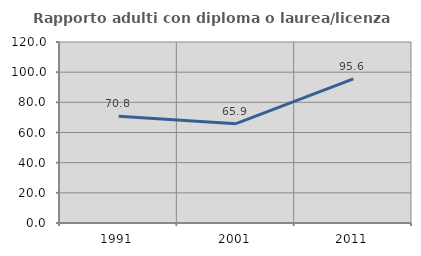
| Category | Rapporto adulti con diploma o laurea/licenza media  |
|---|---|
| 1991.0 | 70.833 |
| 2001.0 | 65.854 |
| 2011.0 | 95.556 |